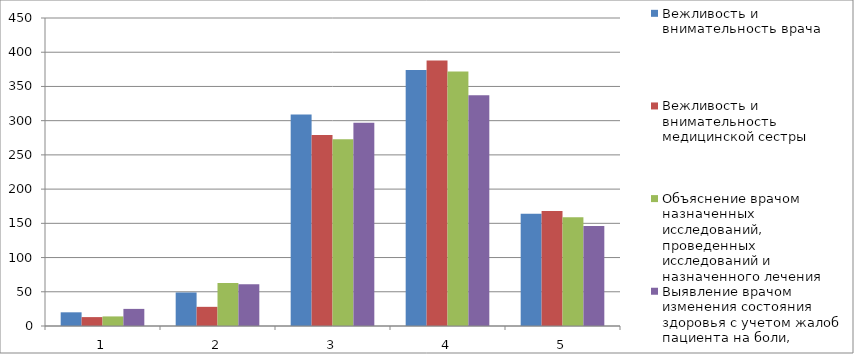
| Category | Вежливость и внимательность врача | Вежливость и внимательность медицинской сестры | Объяснение врачом назначенных исследований, проведенных исследований и назначенного лечения | Выявление врачом изменения состояния здоровья с учетом жалоб пациента на боли, недомогание и прочие ощущения |
|---|---|---|---|---|
| 0 | 20 | 13 | 14 | 25 |
| 1 | 49 | 28 | 63 | 61 |
| 2 | 309 | 279 | 273 | 297 |
| 3 | 374 | 388 | 372 | 337 |
| 4 | 164 | 168 | 159 | 146 |